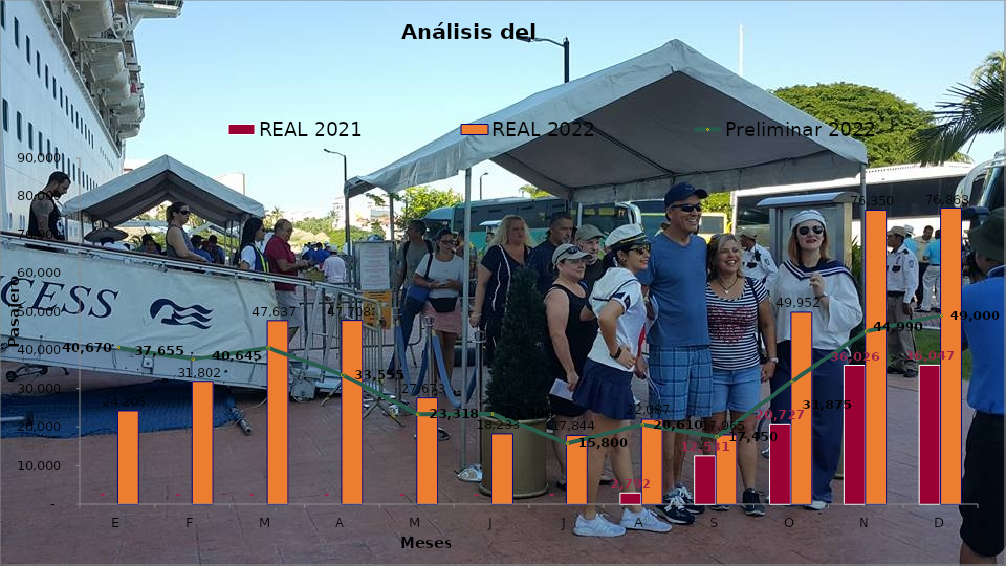
| Category | REAL 2021 | REAL 2022 |
|---|---|---|
| E | 0 | 24205 |
| F | 0 | 31802 |
| M | 0 | 47637 |
| A | 0 | 47708 |
| M | 0 | 27673 |
| J | 0 | 18233 |
| J | 0 | 17844 |
| A | 2792 | 22087 |
| S | 12531 | 17965 |
| O | 20727 | 49952 |
| N | 36026 | 76350 |
| D | 36047 | 76863 |